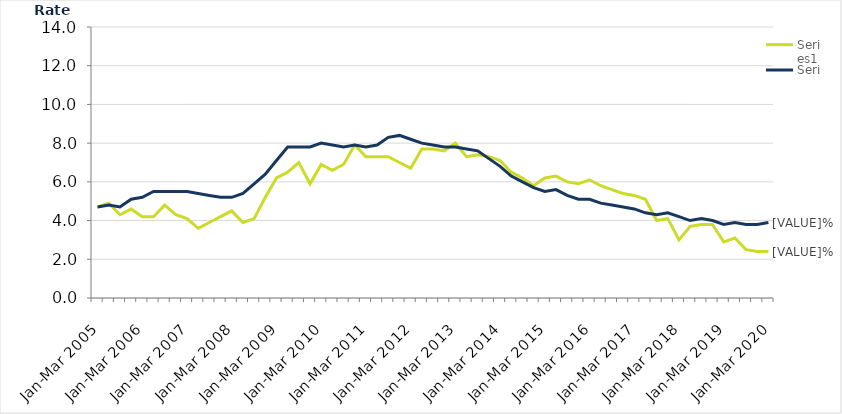
| Category | Series 0 | Series 1 |
|---|---|---|
| Jan-Mar 2005 | 4.7 | 4.7 |
| Apr-Jun 2005 | 4.9 | 4.8 |
| Jul-Sep 2005 | 4.3 | 4.7 |
| Oct-Dec 2005 | 4.6 | 5.1 |
| Jan-Mar 2006 | 4.2 | 5.2 |
| Apr-Jun 2006 | 4.2 | 5.5 |
| Jul-Sep 2006 | 4.8 | 5.5 |
| Oct-Dec 2006 | 4.3 | 5.5 |
| Jan-Mar 2007 | 4.1 | 5.5 |
| Apr-Jun 2007 | 3.6 | 5.4 |
| Jul-Sep 2007 | 3.9 | 5.3 |
| Oct-Dec 2007 | 4.2 | 5.2 |
| Jan-Mar 2008 | 4.5 | 5.2 |
| Apr-Jun 2008 | 3.9 | 5.4 |
| Jul-Sep 2008 | 4.1 | 5.9 |
| Oct-Dec 2008 | 5.2 | 6.4 |
| Jan-Mar 2009 | 6.2 | 7.1 |
| Apr-Jun 2009 | 6.5 | 7.8 |
| Jul-Sep 2009 | 7 | 7.8 |
| Oct-Dec 2009 | 5.9 | 7.8 |
| Jan-Mar 2010 | 6.9 | 8 |
| Apr-Jun 2010 | 6.6 | 7.9 |
| Jul-Sep 2010 | 6.9 | 7.8 |
| Oct-Dec 2010 | 7.9 | 7.9 |
| Jan-Mar 2011 | 7.3 | 7.8 |
| Apr-Jun 2011 | 7.3 | 7.9 |
| Jul-Sep 2011 | 7.3 | 8.3 |
| Oct-Dec 2011 | 7 | 8.4 |
| Jan-Mar 2012 | 6.7 | 8.2 |
| Apr-Jun 2012 | 7.7 | 8 |
| Jul-Sep 2012 | 7.7 | 7.9 |
| Oct-Dec 2012 | 7.6 | 7.8 |
| Jan-Mar 2013 | 8 | 7.8 |
| Apr-Jun 2013 | 7.3 | 7.7 |
| Jul-Sep 2013 | 7.4 | 7.6 |
| Oct-Dec 2013 | 7.3 | 7.2 |
| Jan-Mar 2014 | 7.1 | 6.8 |
| Apr-Jun 2014 | 6.5 | 6.3 |
| Jul-Sep 2014 | 6.2 | 6 |
| Oct-Dec 2014 | 5.8 | 5.7 |
| Jan-Mar 2015 | 6.2 | 5.5 |
| Apr-Jun 2015 | 6.3 | 5.6 |
| Jul-Sep 2015 | 6 | 5.3 |
| Oct-Dec 2015 | 5.9 | 5.1 |
| Jan-Mar 2016 | 6.1 | 5.1 |
| Apr-Jun 2016 | 5.8 | 4.9 |
| Jul-Sep 2016 | 5.6 | 4.8 |
| Oct-Dec 2016 | 5.4 | 4.7 |
| Jan-Mar 2017 | 5.3 | 4.6 |
| Apr-Jun 2017 | 5.1 | 4.4 |
| Jul-Sep 2017 | 4 | 4.3 |
| Oct-Dec 2017 | 4.1 | 4.4 |
| Jan-Mar 2018 | 3 | 4.2 |
| Apr-Jun 2018 | 3.7 | 4 |
| Jul-Sep 2018 | 3.8 | 4.1 |
| Oct-Dec 2018 | 3.8 | 4 |
| Jan-Mar 2019 | 2.9 | 3.8 |
| Apr-Jun 2019 | 3.1 | 3.9 |
| Jul-Sep 2019 | 2.5 | 3.8 |
| Oct-Dec 2019 | 2.4 | 3.8 |
| Jan-Mar 2020 | 2.4 | 3.9 |